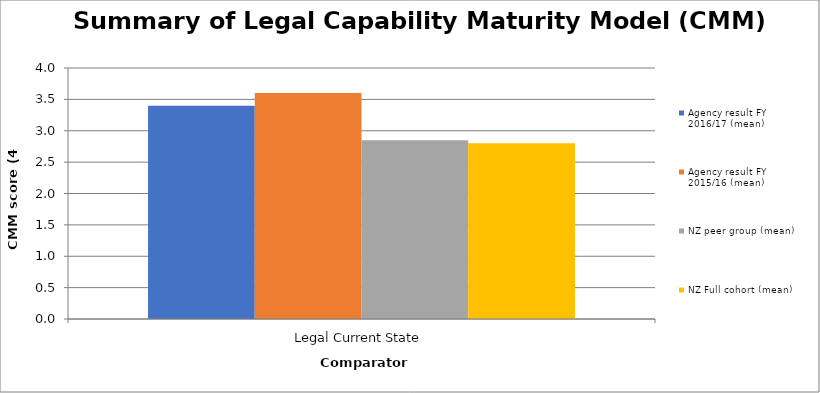
| Category | Agency result FY 2016/17 (mean) | Agency result FY 2015/16 (mean) | NZ peer group (mean) | NZ Full cohort (mean) |
|---|---|---|---|---|
| Legal Current State | 3.4 | 3.6 | 2.85 | 2.8 |